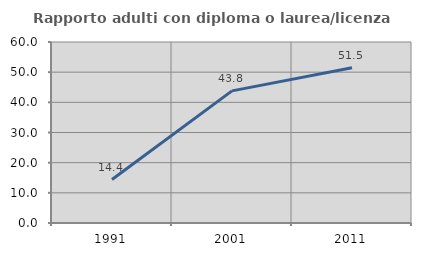
| Category | Rapporto adulti con diploma o laurea/licenza media  |
|---|---|
| 1991.0 | 14.414 |
| 2001.0 | 43.796 |
| 2011.0 | 51.485 |